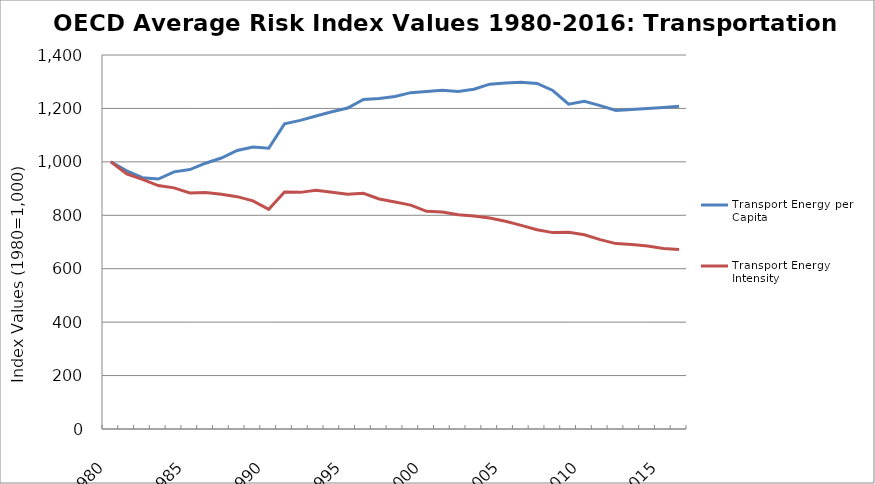
| Category | Transport Energy per Capita | Transport Energy Intensity |
|---|---|---|
| 1980.0 | 1000 | 1000 |
| 1981.0 | 966.062 | 954.588 |
| 1982.0 | 940.629 | 934.701 |
| 1983.0 | 935.613 | 911.234 |
| 1984.0 | 962.498 | 902.653 |
| 1985.0 | 971.213 | 883.399 |
| 1986.0 | 994.878 | 885.438 |
| 1987.0 | 1014.389 | 879.049 |
| 1988.0 | 1042.831 | 869.676 |
| 1989.0 | 1055.529 | 854.032 |
| 1990.0 | 1051.141 | 822.255 |
| 1991.0 | 1142.158 | 886.966 |
| 1992.0 | 1155.254 | 885.805 |
| 1993.0 | 1171.758 | 893.982 |
| 1994.0 | 1187.449 | 885.847 |
| 1995.0 | 1201.67 | 878.564 |
| 1996.0 | 1233.235 | 882.112 |
| 1997.0 | 1236.944 | 861.232 |
| 1998.0 | 1244.795 | 849.968 |
| 1999.0 | 1259.006 | 838.118 |
| 2000.0 | 1263.727 | 814.777 |
| 2001.0 | 1268.173 | 812.152 |
| 2002.0 | 1263.305 | 802.099 |
| 2003.0 | 1272.089 | 797.486 |
| 2004.0 | 1290.767 | 789.758 |
| 2005.0 | 1295.609 | 777.692 |
| 2006.0 | 1297.924 | 762.046 |
| 2007.0 | 1293.52 | 745.929 |
| 2008.0 | 1267.112 | 735.122 |
| 2009.0 | 1215.906 | 736.638 |
| 2010.0 | 1226.61 | 726.867 |
| 2011.0 | 1210.67 | 708.817 |
| 2012.0 | 1192.677 | 693.929 |
| 2013.0 | 1195.876 | 690.447 |
| 2014.0 | 1199.462 | 685.116 |
| 2015.0 | 1203.657 | 675.777 |
| 2016.0 | 1208.454 | 671.508 |